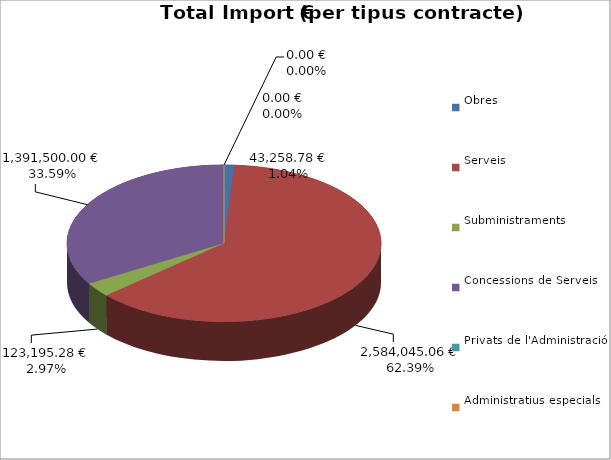
| Category | Total preu
(amb IVA) |
|---|---|
| Obres | 43258.78 |
| Serveis | 2584045.06 |
| Subministraments | 123195.28 |
| Concessions de Serveis | 1391500 |
| Privats de l'Administració | 0 |
| Administratius especials | 0 |